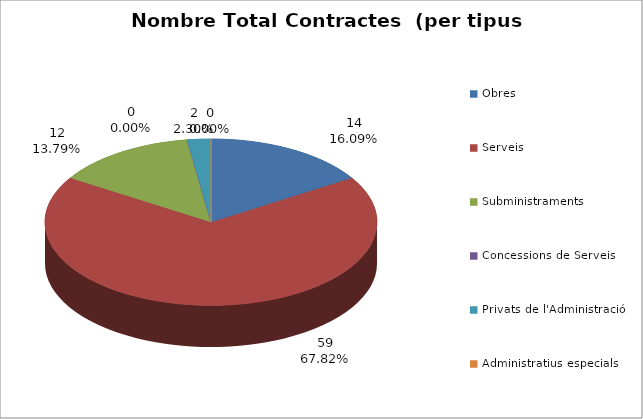
| Category | Nombre Total Contractes |
|---|---|
| Obres | 14 |
| Serveis | 59 |
| Subministraments | 12 |
| Concessions de Serveis | 0 |
| Privats de l'Administració | 2 |
| Administratius especials | 0 |